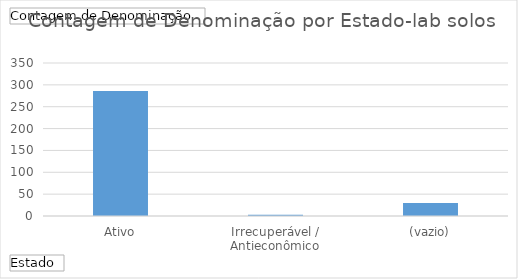
| Category | Total |
|---|---|
| Ativo | 286 |
| Irrecuperável / Antieconômico | 3 |
| (vazio) | 30 |